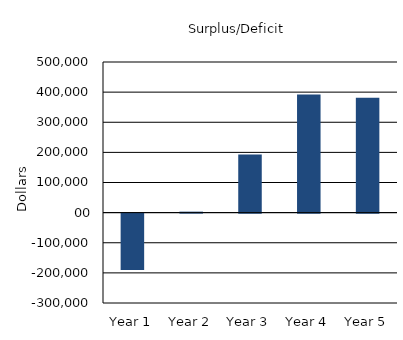
| Category | Series 1 |
|---|---|
| 1.0 | -187125 |
| 2.0 | 3256.25 |
| 3.0 | 193348.938 |
| 4.0 | 391920.313 |
| 5.0 | 381630.922 |